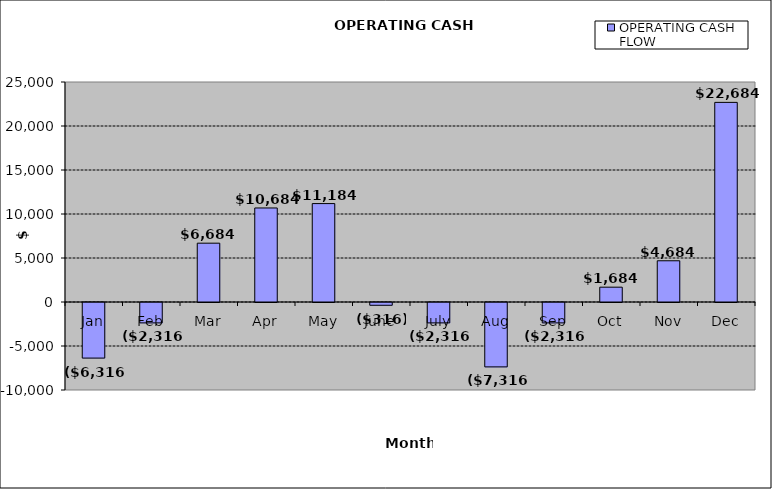
| Category | OPERATING CASH FLOW |
|---|---|
| Jan | -6316 |
| Feb | -2316 |
| Mar | 6684 |
| Apr | 10684 |
| May | 11184 |
| June | -316 |
| July | -2316 |
| Aug | -7316 |
| Sep | -2316 |
| Oct | 1684 |
| Nov | 4684 |
| Dec | 22684 |